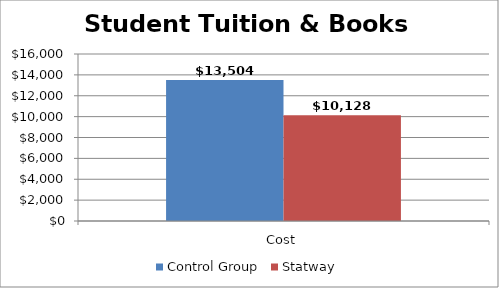
| Category | Control Group | Statway |
|---|---|---|
| Cost | 13504 | 10128 |